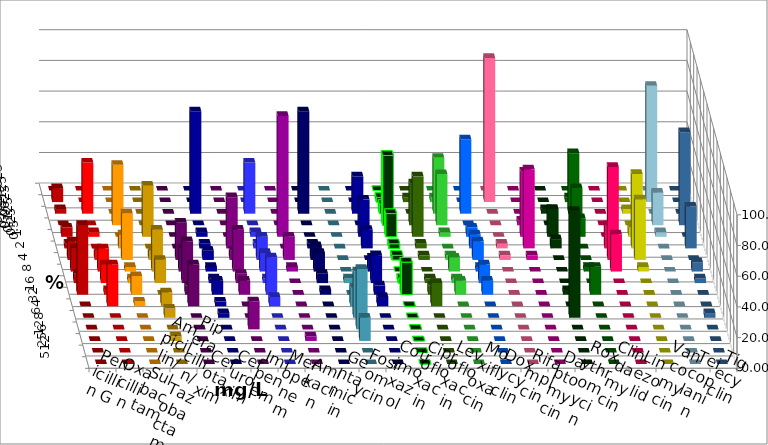
| Category | Penicillin G | Oxacillin | Ampicillin/ Sulbactam | Piperacillin/ Tazobactam | Cefotaxim | Cefuroxim | Imipenem | Meropenem | Amikacin | Gentamicin | Fosfomycin | Cotrimoxazol | Ciprofloxacin | Levofloxacin | Moxifloxacin | Doxycyclin | Rifampicin | Daptomycin | Roxythromycin | Clindamycin | Linezolid | Vancomycin | Teicoplanin | Tigecyclin |
|---|---|---|---|---|---|---|---|---|---|---|---|---|---|---|---|---|---|---|---|---|---|---|---|---|
| 0.015625 | 0 | 0 | 0 | 0 | 0 | 0 | 0 | 0 | 0 | 0 | 0 | 0 | 0 | 0 | 0 | 0 | 0 | 0 | 0 | 0 | 0 | 0 | 0 | 0 |
| 0.03125 | 9.091 | 0 | 0 | 0 | 0 | 0 | 0 | 0 | 0 | 0 | 0 | 0 | 3.03 | 3.03 | 3.03 | 0 | 93.939 | 0 | 0 | 3.03 | 0 | 0 | 0 | 75.758 |
| 0.0625 | 3.03 | 33.333 | 0 | 0 | 0 | 0 | 66.667 | 33.333 | 0 | 66.667 | 0 | 24.242 | 6.061 | 0 | 36.364 | 48.485 | 0 | 0 | 3.03 | 39.394 | 0 | 3.03 | 0 | 0 |
| 0.125 | 0 | 0 | 39.394 | 0 | 0 | 0 | 0 | 0 | 0 | 0 | 0 | 0 | 45.455 | 27.273 | 33.333 | 0 | 0 | 3.03 | 0 | 24.242 | 0 | 0 | 60.606 | 21.212 |
| 0.25 | 6.061 | 3.03 | 0 | 33.333 | 0 | 0 | 3.03 | 3.03 | 78.788 | 0 | 0 | 24.242 | 15.152 | 39.394 | 3.03 | 6.061 | 0 | 42.424 | 18.182 | 12.121 | 0 | 6.061 | 0 | 3.03 |
| 0.5 | 3.03 | 0 | 9.091 | 0 | 0 | 33.333 | 3.03 | 3.03 | 0 | 3.03 | 0 | 12.121 | 3.03 | 3.03 | 0 | 9.091 | 3.03 | 51.515 | 6.061 | 0 | 15.152 | 48.485 | 27.273 | 0 |
| 1.0 | 12.121 | 6.061 | 30.303 | 6.061 | 24.242 | 6.061 | 6.061 | 15.152 | 15.152 | 9.091 | 0 | 0 | 3.03 | 3.03 | 3.03 | 12.121 | 3.03 | 3.03 | 0 | 0 | 60.606 | 39.394 | 0 | 0 |
| 2.0 | 15.152 | 15.152 | 3.03 | 27.273 | 15.152 | 27.273 | 3.03 | 12.121 | 3.03 | 12.121 | 0 | 9.091 | 0 | 0 | 9.091 | 3.03 | 0 | 0 | 0 | 3.03 | 24.242 | 3.03 | 6.061 | 0 |
| 4.0 | 6.061 | 12.121 | 3.03 | 15.152 | 27.273 | 6.061 | 3.03 | 3.03 | 0 | 6.061 | 3.03 | 18.182 | 3.03 | 3.03 | 3.03 | 12.121 | 0 | 0 | 0 | 0 | 0 | 0 | 3.03 | 0 |
| 8.0 | 45.455 | 3.03 | 12.121 | 0 | 6.061 | 9.091 | 9.091 | 24.242 | 0 | 3.03 | 0 | 6.061 | 21.212 | 6.061 | 9.091 | 9.091 | 0 | 0 | 3.03 | 18.182 | 0 | 0 | 0 | 0 |
| 16.0 | 0 | 27.273 | 3.03 | 9.091 | 27.273 | 0 | 3.03 | 6.061 | 0 | 0 | 12.121 | 6.061 | 0 | 15.152 | 0 | 0 | 0 | 0 | 0 | 0 | 0 | 0 | 0 | 0 |
| 32.0 | 0 | 0 | 0 | 6.061 | 0 | 0 | 3.03 | 0 | 0 | 0 | 30.303 | 0 | 0 | 0 | 0 | 0 | 0 | 0 | 69.697 | 0 | 0 | 0 | 3.03 | 0 |
| 64.0 | 0 | 0 | 0 | 0 | 0 | 18.182 | 0 | 0 | 0 | 0 | 39.394 | 0 | 0 | 0 | 0 | 0 | 0 | 0 | 0 | 0 | 0 | 0 | 0 | 0 |
| 128.0 | 0 | 0 | 0 | 3.03 | 0 | 0 | 0 | 0 | 3.03 | 0 | 15.152 | 0 | 0 | 0 | 0 | 0 | 0 | 0 | 0 | 0 | 0 | 0 | 0 | 0 |
| 256.0 | 0 | 0 | 0 | 0 | 0 | 0 | 0 | 0 | 0 | 0 | 0 | 0 | 0 | 0 | 0 | 0 | 0 | 0 | 0 | 0 | 0 | 0 | 0 | 0 |
| 512.0 | 0 | 0 | 0 | 0 | 0 | 0 | 0 | 0 | 0 | 0 | 0 | 0 | 0 | 0 | 0 | 0 | 0 | 0 | 0 | 0 | 0 | 0 | 0 | 0 |